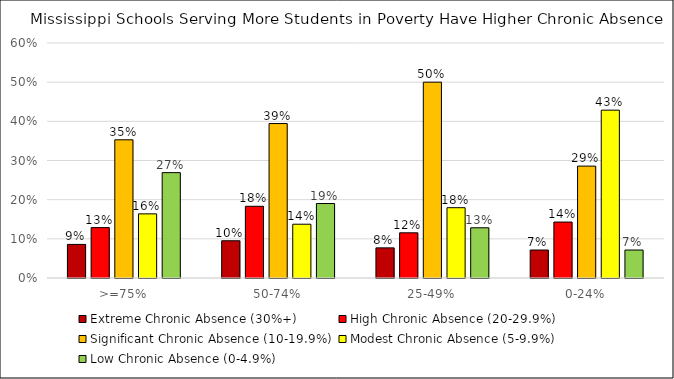
| Category | Extreme Chronic Absence (30%+) | High Chronic Absence (20-29.9%) | Significant Chronic Absence (10-19.9%) | Modest Chronic Absence (5-9.9%) | Low Chronic Absence (0-4.9%) |
|---|---|---|---|---|---|
| >=75% | 0.086 | 0.129 | 0.353 | 0.164 | 0.269 |
| 50-74% | 0.095 | 0.183 | 0.394 | 0.137 | 0.19 |
| 25-49% | 0.077 | 0.115 | 0.5 | 0.179 | 0.128 |
| 0-24% | 0.071 | 0.143 | 0.286 | 0.429 | 0.071 |